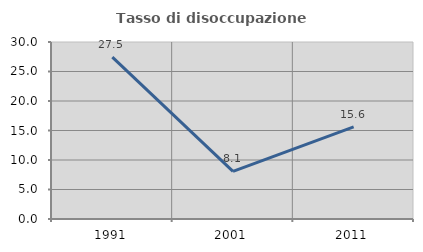
| Category | Tasso di disoccupazione giovanile  |
|---|---|
| 1991.0 | 27.451 |
| 2001.0 | 8.065 |
| 2011.0 | 15.625 |